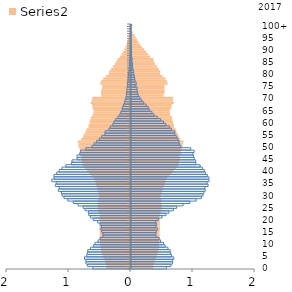
| Category | Series 0 | Series 1 | Stranieri | 0.57 |
|---|---|---|---|---|
| 0 | -0.383 | 0.362 | -0.607 |  |
| 1 | -0.381 | 0.36 | -0.692 |  |
| 2 | -0.398 | 0.377 | -0.719 |  |
| 3 | -0.408 | 0.386 | -0.72 |  |
| 4 | -0.428 | 0.405 | -0.743 |  |
| 5 | -0.442 | 0.418 | -0.705 |  |
| 6 | -0.457 | 0.431 | -0.697 |  |
| 7 | -0.466 | 0.441 | -0.69 |  |
| 8 | -0.475 | 0.45 | -0.644 |  |
| 9 | -0.478 | 0.451 | -0.598 |  |
| 10 | -0.482 | 0.453 | -0.573 |  |
| 11 | -0.483 | 0.453 | -0.523 |  |
| 12 | -0.489 | 0.462 | -0.491 |  |
| 13 | -0.489 | 0.462 | -0.445 |  |
| 14 | -0.486 | 0.46 | -0.443 |  |
| 15 | -0.49 | 0.463 | -0.463 |  |
| 16 | -0.499 | 0.469 | -0.475 |  |
| 17 | -0.49 | 0.463 | -0.468 |  |
| 18 | -0.492 | 0.463 | -0.488 |  |
| 19 | -0.492 | 0.464 | -0.531 |  |
| 20 | -0.492 | 0.464 | -0.603 |  |
| 21 | -0.488 | 0.46 | -0.648 |  |
| 22 | -0.492 | 0.465 | -0.674 |  |
| 23 | -0.502 | 0.477 | -0.678 |  |
| 24 | -0.52 | 0.495 | -0.733 |  |
| 25 | -0.517 | 0.492 | -0.765 |  |
| 26 | -0.52 | 0.495 | -0.846 |  |
| 27 | -0.511 | 0.488 | -0.924 |  |
| 28 | -0.517 | 0.494 | -1.012 |  |
| 29 | -0.499 | 0.478 | -1.073 |  |
| 30 | -0.499 | 0.481 | -1.104 |  |
| 31 | -0.515 | 0.501 | -1.115 |  |
| 32 | -0.523 | 0.51 | -1.165 |  |
| 33 | -0.535 | 0.522 | -1.149 |  |
| 34 | -0.55 | 0.541 | -1.212 |  |
| 35 | -0.555 | 0.549 | -1.198 |  |
| 36 | -0.567 | 0.561 | -1.27 |  |
| 37 | -0.59 | 0.585 | -1.234 |  |
| 38 | -0.627 | 0.624 | -1.235 |  |
| 39 | -0.653 | 0.653 | -1.189 |  |
| 40 | -0.69 | 0.688 | -1.15 |  |
| 41 | -0.729 | 0.729 | -1.105 |  |
| 42 | -0.767 | 0.766 | -1.044 |  |
| 43 | -0.769 | 0.769 | -0.951 |  |
| 44 | -0.778 | 0.777 | -0.943 |  |
| 45 | -0.79 | 0.791 | -0.86 |  |
| 46 | -0.783 | 0.784 | -0.864 |  |
| 47 | -0.809 | 0.811 | -0.819 |  |
| 48 | -0.802 | 0.803 | -0.808 |  |
| 49 | -0.811 | 0.815 | -0.722 |  |
| 50 | -0.83 | 0.834 | -0.62 |  |
| 51 | -0.83 | 0.834 | -0.586 |  |
| 52 | -0.843 | 0.848 | -0.546 |  |
| 53 | -0.787 | 0.798 | -0.498 |  |
| 54 | -0.759 | 0.773 | -0.464 |  |
| 55 | -0.745 | 0.76 | -0.413 |  |
| 56 | -0.719 | 0.735 | -0.41 |  |
| 57 | -0.705 | 0.721 | -0.35 |  |
| 58 | -0.67 | 0.691 | -0.327 |  |
| 59 | -0.667 | 0.689 | -0.286 |  |
| 60 | -0.652 | 0.677 | -0.268 |  |
| 61 | -0.64 | 0.668 | -0.238 |  |
| 62 | -0.629 | 0.663 | -0.204 |  |
| 63 | -0.603 | 0.633 | -0.173 |  |
| 64 | -0.59 | 0.626 | -0.156 |  |
| 65 | -0.587 | 0.627 | -0.134 |  |
| 66 | -0.608 | 0.651 | -0.133 |  |
| 67 | -0.61 | 0.657 | -0.113 |  |
| 68 | -0.632 | 0.69 | -0.099 |  |
| 69 | -0.615 | 0.675 | -0.087 |  |
| 70 | -0.608 | 0.676 | -0.077 |  |
| 71 | -0.463 | 0.522 | -0.066 |  |
| 72 | -0.47 | 0.537 | -0.065 |  |
| 73 | -0.465 | 0.543 | -0.058 |  |
| 74 | -0.454 | 0.538 | -0.059 |  |
| 75 | -0.448 | 0.541 | -0.048 |  |
| 76 | -0.481 | 0.591 | -0.051 |  |
| 77 | -0.463 | 0.577 | -0.041 |  |
| 78 | -0.433 | 0.556 | -0.038 |  |
| 79 | -0.386 | 0.508 | -0.034 |  |
| 80 | -0.344 | 0.471 | -0.031 |  |
| 81 | -0.334 | 0.471 | -0.026 |  |
| 82 | -0.304 | 0.446 | -0.021 |  |
| 83 | -0.275 | 0.419 | -0.017 |  |
| 84 | -0.242 | 0.39 | -0.015 |  |
| 85 | -0.221 | 0.371 | -0.011 |  |
| 86 | -0.202 | 0.362 | -0.011 |  |
| 87 | -0.163 | 0.307 | -0.007 |  |
| 88 | -0.137 | 0.277 | -0.006 |  |
| 89 | -0.114 | 0.245 | -0.005 |  |
| 90 | -0.09 | 0.21 | -0.004 |  |
| 91 | -0.071 | 0.178 | -0.003 |  |
| 92 | -0.056 | 0.147 | -0.002 |  |
| 93 | -0.043 | 0.121 | -0.002 |  |
| 94 | -0.031 | 0.095 | -0.001 |  |
| 95 | -0.022 | 0.074 | -0.001 |  |
| 96 | -0.015 | 0.054 | 0 |  |
| 97 | -0.007 | 0.026 | 0 |  |
| 98 | -0.004 | 0.014 | 0 |  |
| 99 | -0.003 | 0.011 | 0 |  |
| 100 | -0.005 | 0.026 | -0.001 |  |